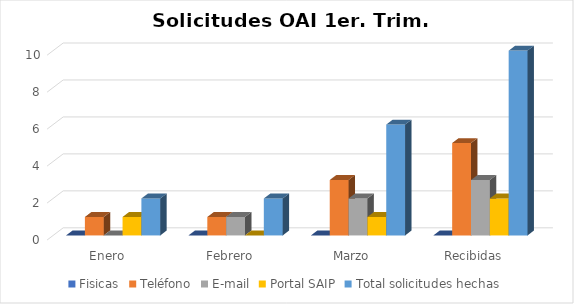
| Category | Fisicas | Teléfono | E-mail | Portal SAIP | Total solicitudes hechas |
|---|---|---|---|---|---|
| Enero | 0 | 1 | 0 | 1 | 2 |
| Febrero | 0 | 1 | 1 | 0 | 2 |
| Marzo | 0 | 3 | 2 | 1 | 6 |
| Recibidas | 0 | 5 | 3 | 2 | 10 |